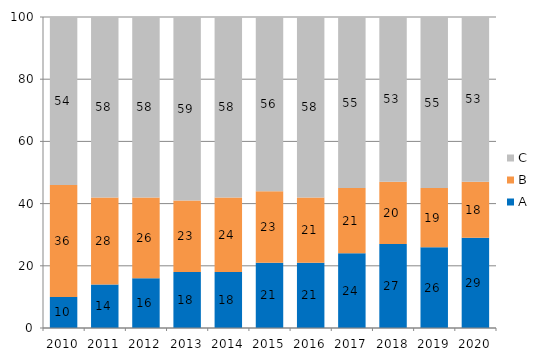
| Category | A | B | C |
|---|---|---|---|
| 2010.0 | 10 | 36 | 54 |
| 2011.0 | 14 | 28 | 58 |
| 2012.0 | 16 | 26 | 58 |
| 2013.0 | 18 | 23 | 59 |
| 2014.0 | 18 | 24 | 58 |
| 2015.0 | 21 | 23 | 56 |
| 2016.0 | 21 | 21 | 58 |
| 2017.0 | 24 | 21 | 55 |
| 2018.0 | 27 | 20 | 53 |
| 2019.0 | 26 | 19 | 55 |
| 2020.0 | 29 | 18 | 53 |